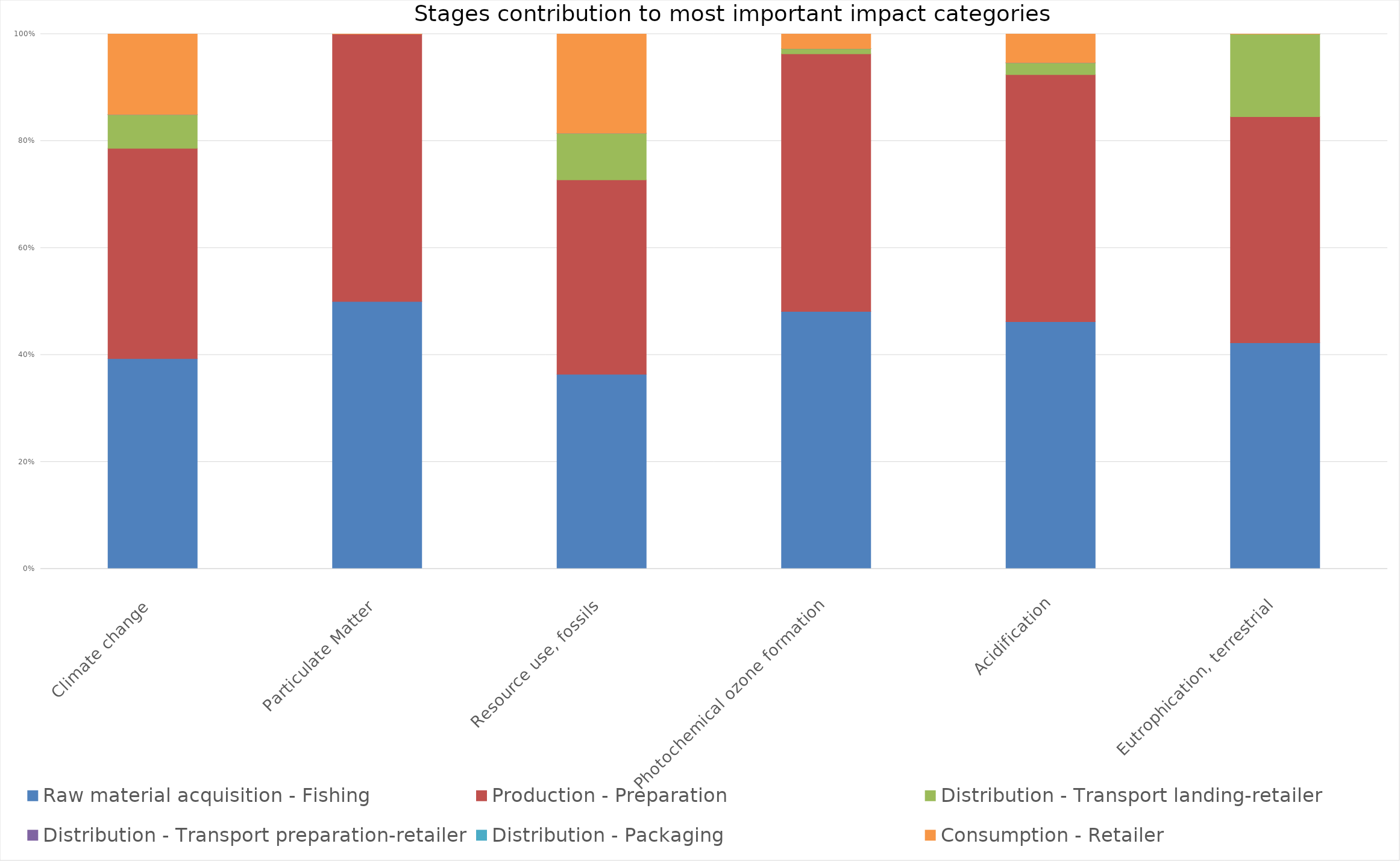
| Category | Raw material acquisition - Fishing | Production - Preparation | Distribution - Transport landing-retailer | Distribution - Transport preparation-retailer | Distribution - Packaging | Consumption - Retailer |
|---|---|---|---|---|---|---|
| Climate change | 0.638 | 0.638 | 0.102 | 0 | 0 | 0.244 |
| Particulate Matter | 1 | 1 | 0 | 0 | 0 | 0 |
| Resource use, fossils | 0.56 | 0.56 | 0.134 | 0 | 0 | 0.285 |
| Photochemical ozone formation | 0.926 | 0.926 | 0.019 | 0 | 0 | 0.052 |
| Acidification | 0.854 | 0.854 | 0.041 | 0 | 0 | 0.099 |
| Eutrophication, terrestrial | 0.732 | 0.732 | 0.268 | 0 | 0 | 0 |